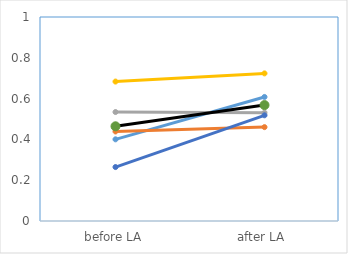
| Category | Series 0 | Series 1 | Series 2 | Series 3 | Series 4 | Series 5 |
|---|---|---|---|---|---|---|
| before LA | 0.4 | 0.439 | 0.534 | 0.684 | 0.264 | 0.464 |
| after LA | 0.608 | 0.46 | 0.531 | 0.724 | 0.518 | 0.568 |